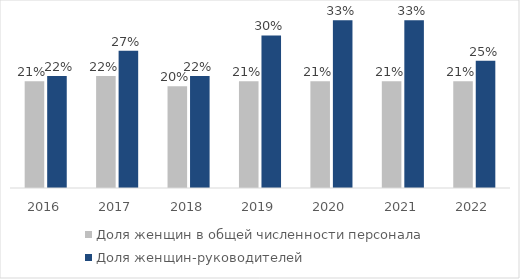
| Category | Доля женщин в общей численности персонала | Доля женщин-руководителей |
|---|---|---|
| 2016.0 | 0.21 | 0.22 |
| 2017.0 | 0.22 | 0.27 |
| 2018.0 | 0.2 | 0.22 |
| 2019.0 | 0.21 | 0.3 |
| 2020.0 | 0.21 | 0.33 |
| 2021.0 | 0.21 | 0.33 |
| 2022.0 | 0.21 | 0.25 |